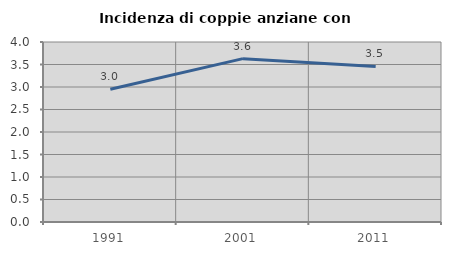
| Category | Incidenza di coppie anziane con figli |
|---|---|
| 1991.0 | 2.952 |
| 2001.0 | 3.63 |
| 2011.0 | 3.457 |